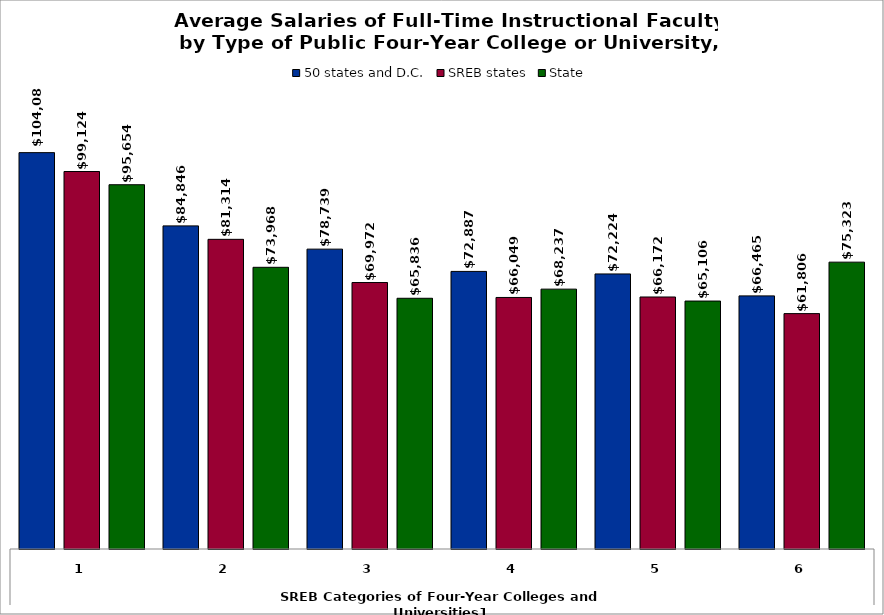
| Category | 50 states and D.C. | SREB states | State |
|---|---|---|---|
| 0 | 104080.09 | 99123.857 | 95653.526 |
| 1 | 84846.239 | 81314.239 | 73968.168 |
| 2 | 78738.901 | 69972.316 | 65835.929 |
| 3 | 72887.359 | 66048.755 | 68237.183 |
| 4 | 72224.246 | 66172.127 | 65105.714 |
| 5 | 66464.807 | 61805.54 | 75322.551 |